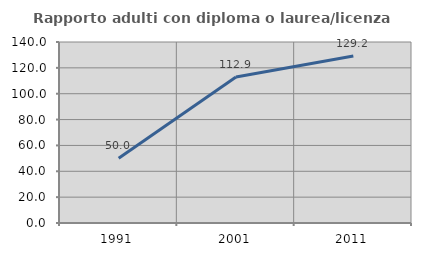
| Category | Rapporto adulti con diploma o laurea/licenza media  |
|---|---|
| 1991.0 | 50 |
| 2001.0 | 112.947 |
| 2011.0 | 129.217 |